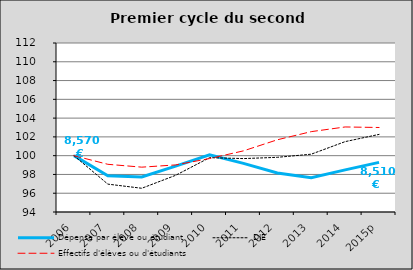
| Category | Dépense par élève ou étudiant  | DIE | Effectifs d'élèves ou d'étudiants |
|---|---|---|---|
| 2006 | 100 | 100 | 100 |
| 2007 | 97.869 | 96.969 | 99.08 |
| 2008 | 97.724 | 96.528 | 98.776 |
| 2009 | 98.883 | 97.907 | 99.014 |
| 2010 | 100.094 | 99.787 | 99.693 |
| 2011 | 99.182 | 99.689 | 100.511 |
| 2012 | 98.162 | 99.823 | 101.692 |
| 2013 | 97.658 | 100.158 | 102.56 |
| 2014 | 98.484 | 101.495 | 103.058 |
| 2015p | 99.286 | 102.265 | 103.001 |